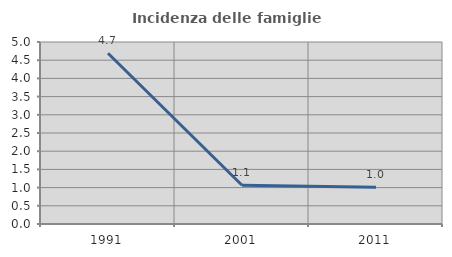
| Category | Incidenza delle famiglie numerose |
|---|---|
| 1991.0 | 4.69 |
| 2001.0 | 1.064 |
| 2011.0 | 1.011 |